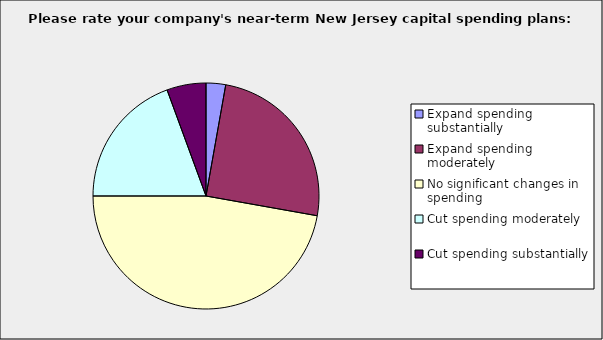
| Category | Series 0 |
|---|---|
| Expand spending substantially | 0.028 |
| Expand spending moderately | 0.25 |
| No significant changes in spending | 0.472 |
| Cut spending moderately | 0.194 |
| Cut spending substantially | 0.056 |